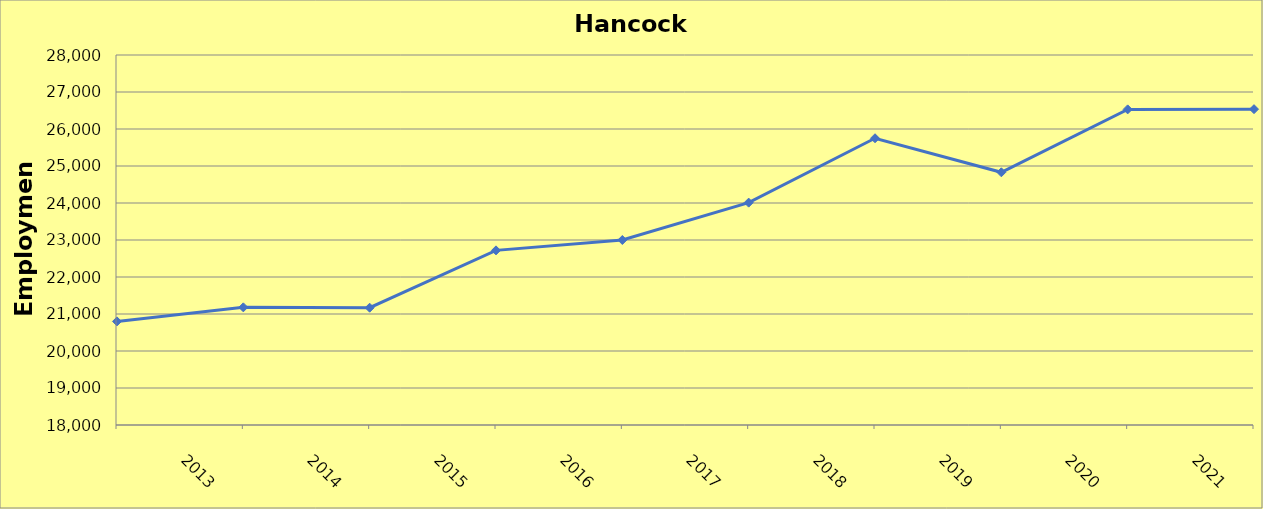
| Category | Hancock County |
|---|---|
| 2013.0 | 20800 |
| 2014.0 | 21180 |
| 2015.0 | 21170 |
| 2016.0 | 22720 |
| 2017.0 | 23000 |
| 2018.0 | 24010 |
| 2019.0 | 25750 |
| 2020.0 | 24830 |
| 2021.0 | 26530 |
| 2022.0 | 26536 |